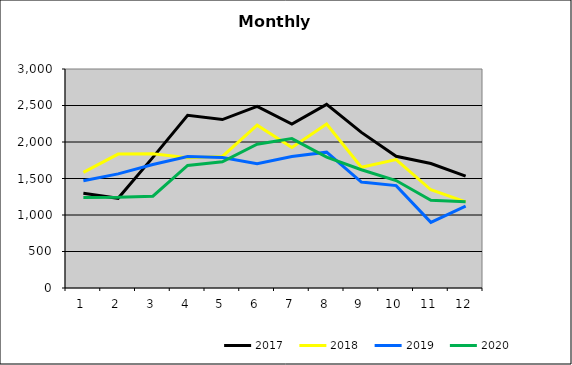
| Category | 2017 | 2018 | 2019 | 2020 |
|---|---|---|---|---|
| 0 | 1297.347 | 1584.945 | 1467.961 | 1241.004 |
| 1 | 1228.546 | 1834.566 | 1563.301 | 1241.851 |
| 2 | 1789.782 | 1838.878 | 1692.17 | 1257.948 |
| 3 | 2364.914 | 1785.082 | 1799.954 | 1678.799 |
| 4 | 2307.576 | 1801.761 | 1787.008 | 1728.302 |
| 5 | 2488.575 | 2229.629 | 1700.928 | 1969.438 |
| 6 | 2244.746 | 1923.685 | 1800.379 | 2046.582 |
| 7 | 2515.952 | 2246.519 | 1860.378 | 1792.692 |
| 8 | 2131.972 | 1654.017 | 1451.067 | 1620.398 |
| 9 | 1804.009 | 1760.102 | 1402.587 | 1472.076 |
| 10 | 1705.861 | 1345.712 | 899.124 | 1200.772 |
| 11 | 1533.212 | 1179.594 | 1120.919 | 1181.152 |